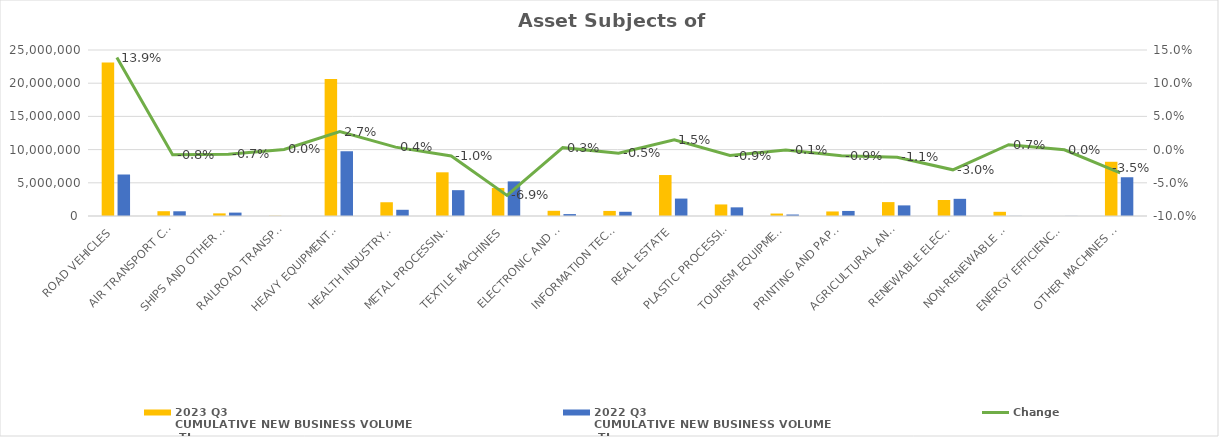
| Category | 2023 Q3 
CUMULATIVE NEW BUSINESS VOLUME
 TL | 2022 Q3 
CUMULATIVE NEW BUSINESS VOLUME
 TL |
|---|---|---|
| ROAD VEHICLES | 23128425.404 | 6249692.014 |
| AIR TRANSPORT CONVEYANCE | 721899.879 | 710489 |
| SHIPS AND OTHER SEA-GOING VESSELS | 396097.765 | 511733.318 |
| RAILROAD TRANSPORT VEHICLES | 29171 | 3944 |
| HEAVY EQUIPMENT AND CONSTRUCTION MACHINERY | 20626636.412 | 9741021.203 |
| HEALTH INDUSTRY AND AESTHETIC INSTRUMENTS | 2070853.593 | 935328.65 |
| METAL PROCESSING MACHINE | 6579706.499 | 3889618.72 |
| TEXTILE MACHINES | 4224533.329 | 5210920.283 |
| ELECTRONIC AND OPTICAL DEVICES | 782014.574 | 287703.771 |
| INFORMATION TECHNOLOGIES AND OFFICE SYSTEMS | 763751.729 | 635054.48 |
| REAL ESTATE | 6169973.624 | 2624353.991 |
| PLASTIC PROCESSING MACHINES | 1739465.303 | 1303954.526 |
| TOURISM EQUIPMENT | 369691.428 | 222090.276 |
| PRINTING AND PAPER PROCESSING MACHINES | 683410.678 | 761664.165 |
| AGRICULTURAL AND LIVESTOCK FARMING MACHINES | 2092392.359 | 1598284.433 |
| RENEWABLE ELECTRICITY GENERATION | 2410574.918 | 2587958.204 |
| NON-RENEWABLE ELECTRIC ENERGY GENERATION | 632020 | 16340.788 |
| ENERGY EFFICIENCY EQUIPMENT | 0 | 15111.342 |
| OTHER MACHINES AND EQUIPMENT | 8167694.66 | 5836067.32 |